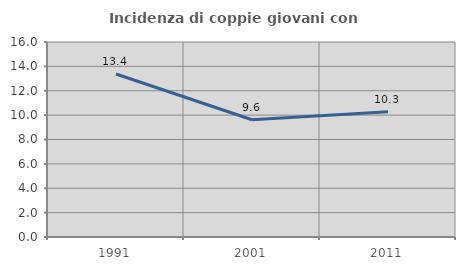
| Category | Incidenza di coppie giovani con figli |
|---|---|
| 1991.0 | 13.378 |
| 2001.0 | 9.621 |
| 2011.0 | 10.284 |